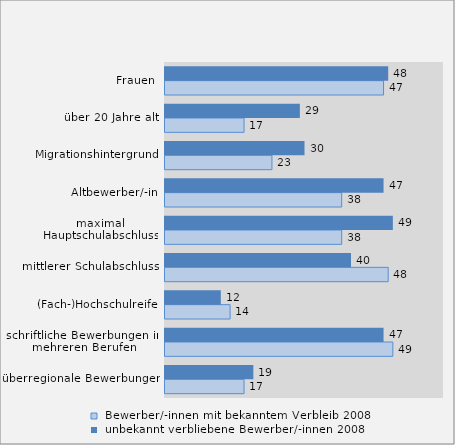
| Category |  Bewerber/-innen mit bekanntem Verbleib 2008 |  unbekannt verbliebene Bewerber/-innen 2008 |
|---|---|---|
| überregionale Bewerbungen | 17 | 19 |
| schriftliche Bewerbungen in mehreren Berufen | 49 | 47 |
| (Fach-)Hochschulreife | 14 | 12 |
| mittlerer Schulabschluss | 48 | 40 |
| maximal Hauptschulabschluss | 38 | 49 |
| Altbewerber/-in | 38 | 47 |
| Migrationshintergrund | 23 | 30 |
| über 20 Jahre alt | 17 | 29 |
| Frauen | 47 | 48 |